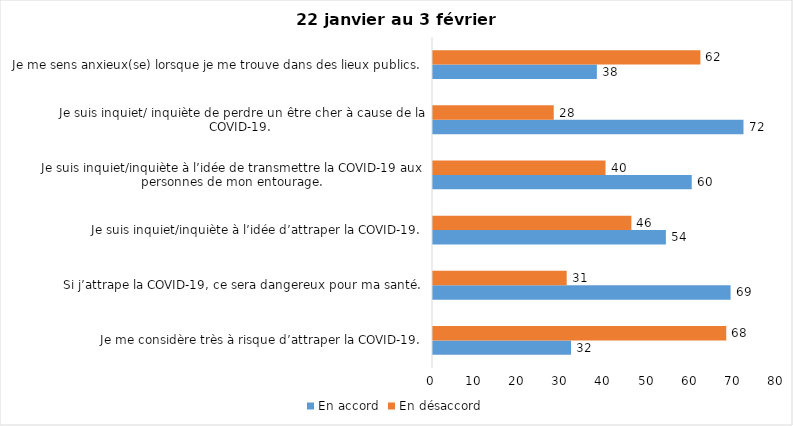
| Category | En accord | En désaccord |
|---|---|---|
| Je me considère très à risque d’attraper la COVID-19. | 32 | 68 |
| Si j’attrape la COVID-19, ce sera dangereux pour ma santé. | 69 | 31 |
| Je suis inquiet/inquiète à l’idée d’attraper la COVID-19. | 54 | 46 |
| Je suis inquiet/inquiète à l’idée de transmettre la COVID-19 aux personnes de mon entourage. | 60 | 40 |
| Je suis inquiet/ inquiète de perdre un être cher à cause de la COVID-19. | 72 | 28 |
| Je me sens anxieux(se) lorsque je me trouve dans des lieux publics. | 38 | 62 |